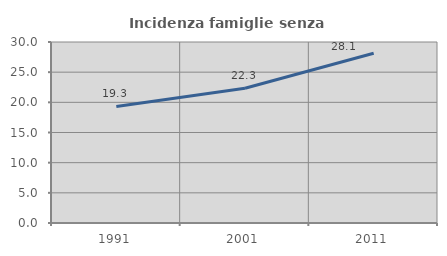
| Category | Incidenza famiglie senza nuclei |
|---|---|
| 1991.0 | 19.319 |
| 2001.0 | 22.341 |
| 2011.0 | 28.13 |